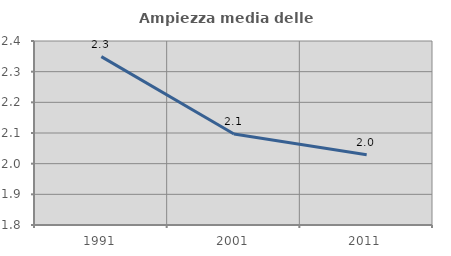
| Category | Ampiezza media delle famiglie |
|---|---|
| 1991.0 | 2.349 |
| 2001.0 | 2.097 |
| 2011.0 | 2.029 |